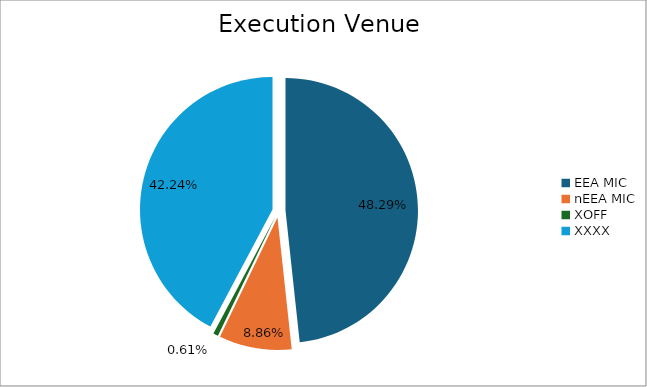
| Category | Series 0 |
|---|---|
| EEA MIC | 6663970.958 |
| nEEA MIC | 1222822.29 |
| XOFF | 84030.133 |
| XXXX | 5829060.96 |